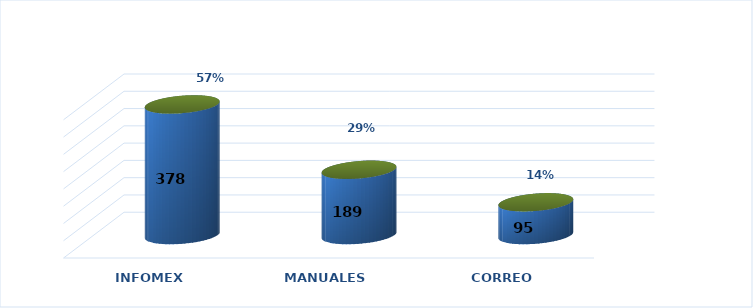
| Category | Series 0 | Series 1 |
|---|---|---|
| INFOMEX | 378 | 0.571 |
| MANUALES | 189 | 0.285 |
| CORREO | 95 | 0.144 |